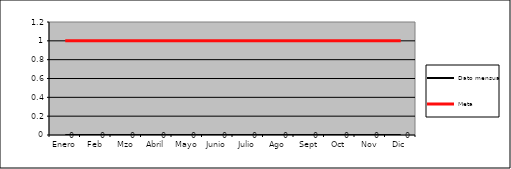
| Category | Dato mensual | Meta |
|---|---|---|
| Enero | 0 | 1 |
| Feb | 0 | 1 |
| Mzo | 0 | 1 |
| Abril | 0 | 1 |
| Mayo | 0 | 1 |
| Junio | 0 | 1 |
| Julio | 0 | 1 |
| Ago | 0 | 1 |
| Sept | 0 | 1 |
| Oct | 0 | 1 |
| Nov | 0 | 1 |
| Dic | 0 | 1 |